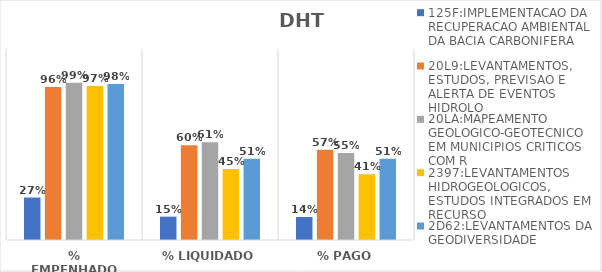
| Category | 125F:IMPLEMENTACAO DA RECUPERACAO AMBIENTAL DA BACIA CARBONIFERA | 20L9:LEVANTAMENTOS, ESTUDOS, PREVISAO E ALERTA DE EVENTOS HIDROLO | 20LA:MAPEAMENTO GEOLOGICO-GEOTECNICO EM MUNICIPIOS CRITICOS COM R | 2397:LEVANTAMENTOS HIDROGEOLOGICOS, ESTUDOS INTEGRADOS EM RECURSO | 2D62:LEVANTAMENTOS DA GEODIVERSIDADE |
|---|---|---|---|---|---|
| % EMPENHADO | 0.267 | 0.961 | 0.987 | 0.968 | 0.98 |
| % LIQUIDADO | 0.147 | 0.595 | 0.614 | 0.447 | 0.51 |
| % PAGO | 0.145 | 0.567 | 0.547 | 0.413 | 0.51 |